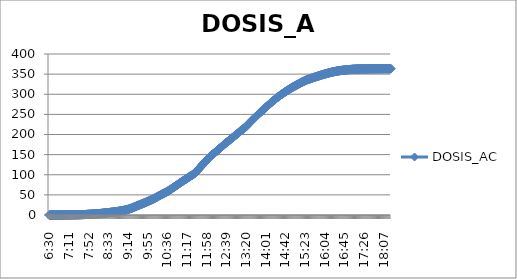
| Category | DOSIS_AC |
|---|---|
| 0.2708333333333333 | 0.002 |
| 0.27152777777777776 | 0.003 |
| 0.2722222222222222 | 0.005 |
| 0.27291666666666664 | 0.006 |
| 0.2736111111111111 | 0.008 |
| 0.2743055555555555 | 0.009 |
| 0.275 | 0.01 |
| 0.27569444444444446 | 0.012 |
| 0.27638888888888885 | 0.013 |
| 0.27708333333333335 | 0.015 |
| 0.2777777777777778 | 0.016 |
| 0.27847222222222223 | 0.018 |
| 0.2791666666666667 | 0.02 |
| 0.2798611111111111 | 0.021 |
| 0.28055555555555556 | 0.024 |
| 0.28125 | 0.027 |
| 0.28194444444444444 | 0.03 |
| 0.2826388888888889 | 0.033 |
| 0.2833333333333333 | 0.036 |
| 0.28402777777777777 | 0.039 |
| 0.2847222222222222 | 0.042 |
| 0.28541666666666665 | 0.045 |
| 0.28611111111111115 | 0.05 |
| 0.28680555555555554 | 0.054 |
| 0.2875 | 0.059 |
| 0.2881944444444445 | 0.065 |
| 0.2888888888888889 | 0.071 |
| 0.28958333333333336 | 0.077 |
| 0.2902777777777778 | 0.084 |
| 0.29097222222222224 | 0.092 |
| 0.2916666666666667 | 0.099 |
| 0.2923611111111111 | 0.108 |
| 0.29305555555555557 | 0.117 |
| 0.29375 | 0.128 |
| 0.29444444444444445 | 0.138 |
| 0.2951388888888889 | 0.15 |
| 0.29583333333333334 | 0.162 |
| 0.2965277777777778 | 0.176 |
| 0.2972222222222222 | 0.189 |
| 0.29791666666666666 | 0.204 |
| 0.2986111111111111 | 0.219 |
| 0.29930555555555555 | 0.234 |
| 0.3 | 0.251 |
| 0.30069444444444443 | 0.267 |
| 0.3013888888888889 | 0.284 |
| 0.3020833333333333 | 0.302 |
| 0.30277777777777776 | 0.32 |
| 0.3034722222222222 | 0.339 |
| 0.30416666666666664 | 0.359 |
| 0.3048611111111111 | 0.38 |
| 0.3055555555555555 | 0.401 |
| 0.30625 | 0.423 |
| 0.3069444444444444 | 0.447 |
| 0.3076388888888889 | 0.471 |
| 0.30833333333333335 | 0.497 |
| 0.3090277777777778 | 0.522 |
| 0.30972222222222223 | 0.548 |
| 0.3104166666666667 | 0.575 |
| 0.3111111111111111 | 0.602 |
| 0.31180555555555556 | 0.63 |
| 0.3125 | 0.659 |
| 0.31319444444444444 | 0.687 |
| 0.3138888888888889 | 0.717 |
| 0.3145833333333333 | 0.747 |
| 0.31527777777777777 | 0.779 |
| 0.3159722222222222 | 0.81 |
| 0.31666666666666665 | 0.843 |
| 0.31736111111111115 | 0.878 |
| 0.31805555555555554 | 0.914 |
| 0.31875 | 0.953 |
| 0.3194444444444445 | 0.993 |
| 0.3201388888888889 | 1.037 |
| 0.32083333333333336 | 1.083 |
| 0.3215277777777778 | 1.133 |
| 0.32222222222222224 | 1.185 |
| 0.3229166666666667 | 1.241 |
| 0.3236111111111111 | 1.299 |
| 0.32430555555555557 | 1.361 |
| 0.325 | 1.425 |
| 0.32569444444444445 | 1.491 |
| 0.3263888888888889 | 1.56 |
| 0.32708333333333334 | 1.629 |
| 0.3277777777777778 | 1.7 |
| 0.3284722222222222 | 1.769 |
| 0.32916666666666666 | 1.835 |
| 0.3298611111111111 | 1.898 |
| 0.33055555555555555 | 1.959 |
| 0.33125 | 2.019 |
| 0.33194444444444443 | 2.079 |
| 0.3326388888888889 | 2.141 |
| 0.3333333333333333 | 2.202 |
| 0.3340277777777778 | 2.267 |
| 0.3347222222222222 | 2.336 |
| 0.3354166666666667 | 2.409 |
| 0.3361111111111111 | 2.489 |
| 0.3368055555555556 | 2.574 |
| 0.3375 | 2.663 |
| 0.33819444444444446 | 2.754 |
| 0.33888888888888885 | 2.849 |
| 0.33958333333333335 | 2.948 |
| 0.34027777777777773 | 3.05 |
| 0.34097222222222223 | 3.155 |
| 0.3416666666666666 | 3.263 |
| 0.3423611111111111 | 3.374 |
| 0.3430555555555555 | 3.488 |
| 0.34375 | 3.603 |
| 0.3444444444444445 | 3.72 |
| 0.3451388888888889 | 3.839 |
| 0.3458333333333334 | 3.957 |
| 0.34652777777777777 | 4.076 |
| 0.34722222222222227 | 4.194 |
| 0.34791666666666665 | 4.316 |
| 0.34861111111111115 | 4.442 |
| 0.34930555555555554 | 4.571 |
| 0.35 | 4.703 |
| 0.3506944444444444 | 4.836 |
| 0.3513888888888889 | 4.968 |
| 0.3520833333333333 | 5.098 |
| 0.3527777777777778 | 5.224 |
| 0.3534722222222222 | 5.348 |
| 0.3541666666666667 | 5.47 |
| 0.3548611111111111 | 5.597 |
| 0.35555555555555557 | 5.727 |
| 0.35625 | 5.864 |
| 0.35694444444444445 | 6.006 |
| 0.3576388888888889 | 6.155 |
| 0.35833333333333334 | 6.306 |
| 0.3590277777777778 | 6.461 |
| 0.3597222222222222 | 6.615 |
| 0.36041666666666666 | 6.77 |
| 0.3611111111111111 | 6.922 |
| 0.36180555555555555 | 7.072 |
| 0.3625 | 7.22 |
| 0.36319444444444443 | 7.362 |
| 0.3638888888888889 | 7.502 |
| 0.3645833333333333 | 7.641 |
| 0.3652777777777778 | 7.782 |
| 0.3659722222222222 | 7.926 |
| 0.3666666666666667 | 8.074 |
| 0.3673611111111111 | 8.228 |
| 0.3680555555555556 | 8.387 |
| 0.36875 | 8.552 |
| 0.36944444444444446 | 8.722 |
| 0.37013888888888885 | 8.901 |
| 0.37083333333333335 | 9.087 |
| 0.37152777777777773 | 9.28 |
| 0.37222222222222223 | 9.48 |
| 0.3729166666666666 | 9.686 |
| 0.3736111111111111 | 9.894 |
| 0.3743055555555555 | 10.106 |
| 0.375 | 10.322 |
| 0.3756944444444445 | 10.54 |
| 0.3763888888888889 | 10.764 |
| 0.3770833333333334 | 10.994 |
| 0.37777777777777777 | 11.229 |
| 0.37847222222222227 | 11.472 |
| 0.37916666666666665 | 11.722 |
| 0.37986111111111115 | 11.98 |
| 0.38055555555555554 | 12.246 |
| 0.38125 | 12.52 |
| 0.3819444444444444 | 12.802 |
| 0.3826388888888889 | 13.093 |
| 0.3833333333333333 | 13.395 |
| 0.3840277777777778 | 13.708 |
| 0.3847222222222222 | 14.038 |
| 0.3854166666666667 | 14.386 |
| 0.3861111111111111 | 14.754 |
| 0.38680555555555557 | 15.14 |
| 0.3875 | 15.54 |
| 0.38819444444444445 | 15.962 |
| 0.3888888888888889 | 16.394 |
| 0.38958333333333334 | 16.839 |
| 0.3902777777777778 | 17.302 |
| 0.3909722222222222 | 17.78 |
| 0.39166666666666666 | 18.252 |
| 0.3923611111111111 | 18.728 |
| 0.39305555555555555 | 19.204 |
| 0.39375 | 19.689 |
| 0.39444444444444443 | 20.184 |
| 0.3951388888888889 | 20.672 |
| 0.3958333333333333 | 21.164 |
| 0.3965277777777778 | 21.659 |
| 0.3972222222222222 | 22.154 |
| 0.3979166666666667 | 22.649 |
| 0.3986111111111111 | 23.15 |
| 0.3993055555555556 | 23.64 |
| 0.4 | 24.131 |
| 0.40069444444444446 | 24.621 |
| 0.40138888888888885 | 25.098 |
| 0.40208333333333335 | 25.571 |
| 0.40277777777777773 | 26.043 |
| 0.40347222222222223 | 26.514 |
| 0.4041666666666666 | 26.985 |
| 0.4048611111111111 | 27.461 |
| 0.4055555555555555 | 27.942 |
| 0.40625 | 28.43 |
| 0.4069444444444445 | 28.926 |
| 0.4076388888888889 | 29.42 |
| 0.4083333333333334 | 29.915 |
| 0.40902777777777777 | 30.413 |
| 0.40972222222222227 | 30.912 |
| 0.41041666666666665 | 31.416 |
| 0.41111111111111115 | 31.926 |
| 0.41180555555555554 | 32.436 |
| 0.4125 | 32.949 |
| 0.4131944444444444 | 33.467 |
| 0.4138888888888889 | 33.987 |
| 0.4145833333333333 | 34.508 |
| 0.4152777777777778 | 35.033 |
| 0.4159722222222222 | 35.562 |
| 0.4166666666666667 | 36.099 |
| 0.4173611111111111 | 36.639 |
| 0.41805555555555557 | 37.182 |
| 0.41875 | 37.728 |
| 0.41944444444444445 | 38.277 |
| 0.4201388888888889 | 38.831 |
| 0.42083333333333334 | 39.389 |
| 0.4215277777777778 | 39.956 |
| 0.4222222222222222 | 40.535 |
| 0.42291666666666666 | 41.13 |
| 0.4236111111111111 | 41.745 |
| 0.42430555555555555 | 42.362 |
| 0.425 | 42.99 |
| 0.42569444444444443 | 43.632 |
| 0.4263888888888889 | 44.303 |
| 0.4270833333333333 | 44.988 |
| 0.4277777777777778 | 45.678 |
| 0.4284722222222222 | 46.352 |
| 0.4291666666666667 | 47.043 |
| 0.4298611111111111 | 47.733 |
| 0.4305555555555556 | 48.384 |
| 0.43125 | 49.017 |
| 0.43194444444444446 | 49.641 |
| 0.43263888888888885 | 50.259 |
| 0.43333333333333335 | 50.871 |
| 0.43402777777777773 | 51.476 |
| 0.43472222222222223 | 52.074 |
| 0.4354166666666666 | 52.67 |
| 0.4361111111111111 | 53.264 |
| 0.4368055555555555 | 53.858 |
| 0.4375 | 54.455 |
| 0.4381944444444445 | 55.058 |
| 0.4388888888888889 | 55.671 |
| 0.4395833333333334 | 56.298 |
| 0.44027777777777777 | 56.942 |
| 0.44097222222222227 | 57.608 |
| 0.44166666666666665 | 58.299 |
| 0.44236111111111115 | 59.01 |
| 0.44305555555555554 | 59.724 |
| 0.44375 | 60.461 |
| 0.4444444444444444 | 61.208 |
| 0.4451388888888889 | 61.97 |
| 0.4458333333333333 | 62.771 |
| 0.4465277777777778 | 63.567 |
| 0.4472222222222222 | 64.335 |
| 0.4479166666666667 | 65.124 |
| 0.4486111111111111 | 65.916 |
| 0.44930555555555557 | 66.75 |
| 0.45 | 67.587 |
| 0.45069444444444445 | 68.402 |
| 0.4513888888888889 | 69.21 |
| 0.45208333333333334 | 70.023 |
| 0.4527777777777778 | 70.838 |
| 0.4534722222222222 | 71.651 |
| 0.45416666666666666 | 72.456 |
| 0.4548611111111111 | 73.256 |
| 0.45555555555555555 | 74.052 |
| 0.45625 | 74.858 |
| 0.45694444444444443 | 75.692 |
| 0.4576388888888889 | 76.542 |
| 0.4583333333333333 | 77.394 |
| 0.4590277777777778 | 78.296 |
| 0.4597222222222222 | 79.152 |
| 0.4604166666666667 | 79.968 |
| 0.4611111111111111 | 80.772 |
| 0.4618055555555556 | 81.622 |
| 0.4625 | 82.384 |
| 0.46319444444444446 | 83.13 |
| 0.46388888888888885 | 83.908 |
| 0.46458333333333335 | 84.712 |
| 0.46527777777777773 | 85.473 |
| 0.46597222222222223 | 86.212 |
| 0.4666666666666666 | 86.974 |
| 0.4673611111111111 | 87.742 |
| 0.4680555555555555 | 88.502 |
| 0.46875 | 89.252 |
| 0.4694444444444445 | 90.011 |
| 0.4701388888888889 | 90.806 |
| 0.4708333333333334 | 91.587 |
| 0.47152777777777777 | 92.418 |
| 0.47222222222222227 | 93.238 |
| 0.47291666666666665 | 94.136 |
| 0.47361111111111115 | 94.997 |
| 0.47430555555555554 | 95.762 |
| 0.475 | 96.51 |
| 0.4756944444444444 | 97.256 |
| 0.4763888888888889 | 97.92 |
| 0.4770833333333333 | 98.463 |
| 0.4777777777777778 | 99.048 |
| 0.4784722222222222 | 99.845 |
| 0.4791666666666667 | 100.649 |
| 0.4798611111111111 | 101.55 |
| 0.48055555555555557 | 102.533 |
| 0.48125 | 103.547 |
| 0.48194444444444445 | 104.648 |
| 0.4826388888888889 | 105.783 |
| 0.48333333333333334 | 107.019 |
| 0.4840277777777778 | 108.318 |
| 0.4847222222222222 | 109.625 |
| 0.48541666666666666 | 110.916 |
| 0.4861111111111111 | 112.278 |
| 0.48680555555555555 | 113.592 |
| 0.4875 | 114.9 |
| 0.48819444444444443 | 116.234 |
| 0.4888888888888889 | 117.501 |
| 0.4895833333333333 | 118.73 |
| 0.4902777777777778 | 120.077 |
| 0.4909722222222222 | 121.455 |
| 0.4916666666666667 | 122.813 |
| 0.4923611111111111 | 124.199 |
| 0.4930555555555556 | 125.524 |
| 0.49375 | 126.87 |
| 0.49444444444444446 | 128.253 |
| 0.49513888888888885 | 129.585 |
| 0.49583333333333335 | 130.948 |
| 0.49652777777777773 | 132.238 |
| 0.49722222222222223 | 133.48 |
| 0.4979166666666666 | 134.733 |
| 0.4986111111111111 | 136.032 |
| 0.4993055555555555 | 137.306 |
| 0.5 | 138.608 |
| 0.5006944444444444 | 139.935 |
| 0.5013888888888889 | 141.18 |
| 0.5020833333333333 | 142.449 |
| 0.5027777777777778 | 143.635 |
| 0.5034722222222222 | 144.741 |
| 0.5041666666666667 | 145.837 |
| 0.5048611111111111 | 146.876 |
| 0.5055555555555555 | 148.032 |
| 0.50625 | 149.082 |
| 0.5069444444444444 | 150.064 |
| 0.5076388888888889 | 150.993 |
| 0.5083333333333333 | 151.932 |
| 0.5090277777777777 | 152.901 |
| 0.5097222222222222 | 153.855 |
| 0.5104166666666666 | 154.863 |
| 0.5111111111111112 | 155.853 |
| 0.5118055555555555 | 156.834 |
| 0.5125 | 157.766 |
| 0.5131944444444444 | 158.674 |
| 0.513888888888889 | 159.646 |
| 0.5145833333333333 | 160.611 |
| 0.5152777777777778 | 161.607 |
| 0.5159722222222222 | 162.686 |
| 0.5166666666666667 | 163.808 |
| 0.517361111111111 | 164.838 |
| 0.5180555555555556 | 165.916 |
| 0.51875 | 167.004 |
| 0.5194444444444445 | 168.072 |
| 0.5201388888888888 | 169.154 |
| 0.5208333333333334 | 170.194 |
| 0.5215277777777778 | 171.242 |
| 0.5222222222222223 | 172.298 |
| 0.5229166666666667 | 173.308 |
| 0.5236111111111111 | 174.335 |
| 0.5243055555555556 | 175.485 |
| 0.525 | 176.589 |
| 0.5256944444444445 | 177.722 |
| 0.5263888888888889 | 178.689 |
| 0.5270833333333333 | 179.627 |
| 0.5277777777777778 | 180.53 |
| 0.5284722222222222 | 181.416 |
| 0.5291666666666667 | 182.292 |
| 0.5298611111111111 | 183.167 |
| 0.5305555555555556 | 184.092 |
| 0.53125 | 185.141 |
| 0.5319444444444444 | 186.078 |
| 0.5326388888888889 | 187.052 |
| 0.5333333333333333 | 187.982 |
| 0.5340277777777778 | 188.984 |
| 0.5347222222222222 | 190.107 |
| 0.5354166666666667 | 191.045 |
| 0.5361111111111111 | 191.973 |
| 0.5368055555555555 | 192.941 |
| 0.5375 | 193.877 |
| 0.5381944444444444 | 194.771 |
| 0.5388888888888889 | 195.794 |
| 0.5395833333333333 | 197.034 |
| 0.5402777777777777 | 198.008 |
| 0.5409722222222222 | 198.914 |
| 0.5416666666666666 | 199.797 |
| 0.5423611111111112 | 200.63 |
| 0.5430555555555555 | 201.518 |
| 0.54375 | 202.547 |
| 0.5444444444444444 | 203.619 |
| 0.545138888888889 | 204.707 |
| 0.5458333333333333 | 205.886 |
| 0.5465277777777778 | 206.985 |
| 0.5472222222222222 | 207.96 |
| 0.5479166666666667 | 208.917 |
| 0.548611111111111 | 209.835 |
| 0.5493055555555556 | 210.704 |
| 0.55 | 211.625 |
| 0.5506944444444445 | 212.528 |
| 0.5513888888888888 | 213.353 |
| 0.5520833333333334 | 214.298 |
| 0.5527777777777778 | 215.268 |
| 0.5534722222222223 | 216.288 |
| 0.5541666666666667 | 217.283 |
| 0.5548611111111111 | 218.256 |
| 0.5555555555555556 | 219.323 |
| 0.55625 | 220.553 |
| 0.5569444444444445 | 221.813 |
| 0.5576388888888889 | 223.074 |
| 0.5583333333333333 | 224.303 |
| 0.5590277777777778 | 225.545 |
| 0.5597222222222222 | 226.788 |
| 0.5604166666666667 | 227.981 |
| 0.5611111111111111 | 229.227 |
| 0.5618055555555556 | 230.448 |
| 0.5625 | 231.651 |
| 0.5631944444444444 | 232.856 |
| 0.5638888888888889 | 234.051 |
| 0.5645833333333333 | 235.242 |
| 0.5652777777777778 | 236.433 |
| 0.5659722222222222 | 237.626 |
| 0.5666666666666667 | 238.814 |
| 0.5673611111111111 | 239.999 |
| 0.5680555555555555 | 241.181 |
| 0.56875 | 242.349 |
| 0.5694444444444444 | 243.515 |
| 0.5701388888888889 | 244.682 |
| 0.5708333333333333 | 245.849 |
| 0.5715277777777777 | 247.022 |
| 0.5722222222222222 | 248.199 |
| 0.5729166666666666 | 249.359 |
| 0.5736111111111112 | 250.518 |
| 0.5743055555555555 | 251.652 |
| 0.575 | 252.747 |
| 0.5756944444444444 | 253.806 |
| 0.576388888888889 | 254.888 |
| 0.5770833333333333 | 256.005 |
| 0.5777777777777778 | 257.115 |
| 0.5784722222222222 | 258.236 |
| 0.5791666666666667 | 259.332 |
| 0.579861111111111 | 260.412 |
| 0.5805555555555556 | 261.501 |
| 0.58125 | 262.614 |
| 0.5819444444444445 | 263.722 |
| 0.5826388888888888 | 264.819 |
| 0.5833333333333334 | 265.911 |
| 0.5840277777777778 | 266.985 |
| 0.5847222222222223 | 268.059 |
| 0.5854166666666667 | 269.136 |
| 0.5861111111111111 | 270.204 |
| 0.5868055555555556 | 271.224 |
| 0.5875 | 272.234 |
| 0.5881944444444445 | 273.297 |
| 0.5888888888888889 | 274.384 |
| 0.5895833333333333 | 275.468 |
| 0.5902777777777778 | 276.55 |
| 0.5909722222222222 | 277.624 |
| 0.5916666666666667 | 278.649 |
| 0.5923611111111111 | 279.663 |
| 0.5930555555555556 | 280.686 |
| 0.59375 | 281.697 |
| 0.5944444444444444 | 282.698 |
| 0.5951388888888889 | 283.683 |
| 0.5958333333333333 | 284.669 |
| 0.5965277777777778 | 285.647 |
| 0.5972222222222222 | 286.635 |
| 0.5979166666666667 | 287.624 |
| 0.5986111111111111 | 288.606 |
| 0.5993055555555555 | 289.592 |
| 0.6 | 290.571 |
| 0.6006944444444444 | 291.544 |
| 0.6013888888888889 | 292.475 |
| 0.6020833333333333 | 293.379 |
| 0.6027777777777777 | 294.288 |
| 0.6034722222222222 | 295.191 |
| 0.6041666666666666 | 296.093 |
| 0.6048611111111112 | 296.994 |
| 0.6055555555555555 | 297.879 |
| 0.60625 | 298.737 |
| 0.6069444444444444 | 299.534 |
| 0.607638888888889 | 300.35 |
| 0.6083333333333333 | 301.164 |
| 0.6090277777777778 | 301.976 |
| 0.6097222222222222 | 302.787 |
| 0.6104166666666667 | 303.603 |
| 0.611111111111111 | 304.431 |
| 0.6118055555555556 | 305.256 |
| 0.6125 | 306.056 |
| 0.6131944444444445 | 306.846 |
| 0.6138888888888888 | 307.628 |
| 0.6145833333333334 | 308.388 |
| 0.6152777777777778 | 309.096 |
| 0.6159722222222223 | 309.802 |
| 0.6166666666666667 | 310.528 |
| 0.6173611111111111 | 311.256 |
| 0.6180555555555556 | 312.027 |
| 0.61875 | 312.813 |
| 0.6194444444444445 | 313.595 |
| 0.6201388888888889 | 314.361 |
| 0.6208333333333333 | 315.137 |
| 0.6215277777777778 | 315.914 |
| 0.6222222222222222 | 316.659 |
| 0.6229166666666667 | 317.369 |
| 0.6236111111111111 | 317.906 |
| 0.6243055555555556 | 318.452 |
| 0.625 | 319.116 |
| 0.6256944444444444 | 319.81 |
| 0.6263888888888889 | 320.499 |
| 0.6270833333333333 | 321.196 |
| 0.6277777777777778 | 321.904 |
| 0.6284722222222222 | 322.497 |
| 0.6291666666666667 | 323.023 |
| 0.6298611111111111 | 323.571 |
| 0.6305555555555555 | 324.225 |
| 0.63125 | 324.928 |
| 0.6319444444444444 | 325.633 |
| 0.6326388888888889 | 326.31 |
| 0.6333333333333333 | 326.992 |
| 0.6340277777777777 | 327.669 |
| 0.6347222222222222 | 328.302 |
| 0.6354166666666666 | 328.915 |
| 0.6361111111111112 | 329.527 |
| 0.6368055555555555 | 330.127 |
| 0.6375 | 330.7 |
| 0.6381944444444444 | 331.203 |
| 0.638888888888889 | 331.716 |
| 0.6395833333333333 | 332.311 |
| 0.6402777777777778 | 332.892 |
| 0.6409722222222222 | 333.439 |
| 0.6416666666666667 | 334.015 |
| 0.642361111111111 | 334.551 |
| 0.6430555555555556 | 335.116 |
| 0.64375 | 335.695 |
| 0.6444444444444445 | 336.198 |
| 0.6451388888888888 | 336.631 |
| 0.6458333333333334 | 337.044 |
| 0.6465277777777778 | 337.447 |
| 0.6472222222222223 | 337.843 |
| 0.6479166666666667 | 338.232 |
| 0.6486111111111111 | 338.619 |
| 0.6493055555555556 | 339.016 |
| 0.65 | 339.453 |
| 0.6506944444444445 | 339.915 |
| 0.6513888888888889 | 340.362 |
| 0.6520833333333333 | 340.779 |
| 0.6527777777777778 | 341.169 |
| 0.6534722222222222 | 341.536 |
| 0.6541666666666667 | 341.889 |
| 0.6548611111111111 | 342.234 |
| 0.6555555555555556 | 342.597 |
| 0.65625 | 342.986 |
| 0.6569444444444444 | 343.37 |
| 0.6576388888888889 | 343.737 |
| 0.6583333333333333 | 344.118 |
| 0.6590277777777778 | 344.508 |
| 0.6597222222222222 | 344.9 |
| 0.6604166666666667 | 345.272 |
| 0.6611111111111111 | 345.633 |
| 0.6618055555555555 | 346.006 |
| 0.6625 | 346.413 |
| 0.6631944444444444 | 346.833 |
| 0.6638888888888889 | 347.251 |
| 0.6645833333333333 | 347.662 |
| 0.6652777777777777 | 348.046 |
| 0.6659722222222222 | 348.381 |
| 0.6666666666666666 | 348.7 |
| 0.6673611111111111 | 349.012 |
| 0.6680555555555556 | 349.346 |
| 0.66875 | 349.708 |
| 0.6694444444444444 | 350.066 |
| 0.6701388888888888 | 350.42 |
| 0.6708333333333334 | 350.772 |
| 0.6715277777777778 | 351.122 |
| 0.6722222222222222 | 351.448 |
| 0.6729166666666666 | 351.737 |
| 0.6736111111111112 | 352.016 |
| 0.6743055555555556 | 352.308 |
| 0.675 | 352.623 |
| 0.6756944444444444 | 352.948 |
| 0.6763888888888889 | 353.276 |
| 0.6770833333333334 | 353.602 |
| 0.6777777777777777 | 353.931 |
| 0.6784722222222223 | 354.258 |
| 0.6791666666666667 | 354.58 |
| 0.6798611111111111 | 354.896 |
| 0.6805555555555555 | 355.196 |
| 0.68125 | 355.49 |
| 0.6819444444444445 | 355.742 |
| 0.6826388888888889 | 355.97 |
| 0.6833333333333332 | 356.19 |
| 0.6840277777777778 | 356.409 |
| 0.6847222222222222 | 356.626 |
| 0.6854166666666667 | 356.86 |
| 0.686111111111111 | 357.1 |
| 0.6868055555555556 | 357.34 |
| 0.6875 | 357.567 |
| 0.6881944444444444 | 357.778 |
| 0.688888888888889 | 357.993 |
| 0.6895833333333333 | 358.203 |
| 0.6902777777777778 | 358.384 |
| 0.6909722222222222 | 358.544 |
| 0.6916666666666668 | 358.698 |
| 0.6923611111111111 | 358.848 |
| 0.6930555555555555 | 358.995 |
| 0.69375 | 359.14 |
| 0.6944444444444445 | 359.286 |
| 0.6951388888888889 | 359.432 |
| 0.6958333333333333 | 359.578 |
| 0.6965277777777777 | 359.724 |
| 0.6972222222222223 | 359.87 |
| 0.6979166666666666 | 360.014 |
| 0.6986111111111111 | 360.155 |
| 0.6993055555555556 | 360.294 |
| 0.7 | 360.431 |
| 0.7006944444444444 | 360.563 |
| 0.7013888888888888 | 360.692 |
| 0.7020833333333334 | 360.818 |
| 0.7027777777777778 | 360.941 |
| 0.7034722222222222 | 361.061 |
| 0.7041666666666666 | 361.176 |
| 0.7048611111111112 | 361.287 |
| 0.7055555555555556 | 361.392 |
| 0.70625 | 361.491 |
| 0.7069444444444444 | 361.586 |
| 0.7076388888888889 | 361.677 |
| 0.7083333333333334 | 361.766 |
| 0.7090277777777777 | 361.853 |
| 0.7097222222222223 | 361.937 |
| 0.7104166666666667 | 362.018 |
| 0.7111111111111111 | 362.096 |
| 0.7118055555555555 | 362.171 |
| 0.7125 | 362.241 |
| 0.7131944444444445 | 362.309 |
| 0.7138888888888889 | 362.372 |
| 0.7145833333333332 | 362.429 |
| 0.7152777777777778 | 362.481 |
| 0.7159722222222222 | 362.529 |
| 0.7166666666666667 | 362.574 |
| 0.717361111111111 | 362.616 |
| 0.7180555555555556 | 362.655 |
| 0.71875 | 362.691 |
| 0.7194444444444444 | 362.724 |
| 0.720138888888889 | 362.756 |
| 0.7208333333333333 | 362.784 |
| 0.7215277777777778 | 362.811 |
| 0.7222222222222222 | 362.837 |
| 0.7229166666666668 | 362.859 |
| 0.7236111111111111 | 362.88 |
| 0.7243055555555555 | 362.9 |
| 0.725 | 362.918 |
| 0.7256944444444445 | 362.936 |
| 0.7263888888888889 | 362.952 |
| 0.7270833333333333 | 362.967 |
| 0.7277777777777777 | 362.982 |
| 0.7284722222222223 | 362.997 |
| 0.7291666666666666 | 363.012 |
| 0.7298611111111111 | 363.027 |
| 0.7305555555555556 | 363.042 |
| 0.73125 | 363.057 |
| 0.7319444444444444 | 363.072 |
| 0.7326388888888888 | 363.087 |
| 0.7333333333333334 | 363.102 |
| 0.7340277777777778 | 363.117 |
| 0.7347222222222222 | 363.132 |
| 0.7354166666666666 | 363.147 |
| 0.7361111111111112 | 363.162 |
| 0.7368055555555556 | 363.177 |
| 0.7375 | 363.192 |
| 0.7381944444444444 | 363.207 |
| 0.7388888888888889 | 363.222 |
| 0.7395833333333334 | 363.235 |
| 0.7402777777777777 | 363.249 |
| 0.7409722222222223 | 363.262 |
| 0.7416666666666667 | 363.276 |
| 0.7423611111111111 | 363.288 |
| 0.7430555555555555 | 363.3 |
| 0.74375 | 363.312 |
| 0.7444444444444445 | 363.322 |
| 0.7451388888888889 | 363.333 |
| 0.7458333333333332 | 363.343 |
| 0.7465277777777778 | 363.352 |
| 0.7472222222222222 | 363.361 |
| 0.7479166666666667 | 363.37 |
| 0.748611111111111 | 363.379 |
| 0.7493055555555556 | 363.387 |
| 0.75 | 363.394 |
| 0.7506944444444444 | 363.402 |
| 0.751388888888889 | 363.409 |
| 0.7520833333333333 | 363.417 |
| 0.7527777777777778 | 363.423 |
| 0.7534722222222222 | 363.429 |
| 0.7541666666666668 | 363.435 |
| 0.7548611111111111 | 363.439 |
| 0.7555555555555555 | 363.444 |
| 0.75625 | 363.447 |
| 0.7569444444444445 | 363.45 |
| 0.7576388888888889 | 363.453 |
| 0.7583333333333333 | 363.456 |
| 0.7590277777777777 | 363.459 |
| 0.7597222222222223 | 363.462 |
| 0.7604166666666666 | 363.465 |
| 0.7611111111111111 | 363.466 |
| 0.7618055555555556 | 363.468 |
| 0.7625 | 363.469 |
| 0.7631944444444444 | 363.471 |
| 0.7638888888888888 | 363.472 |
| 0.7645833333333334 | 363.474 |
| 0.7652777777777778 | 363.475 |